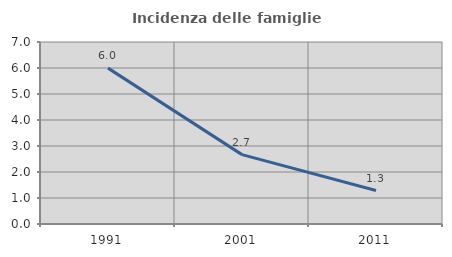
| Category | Incidenza delle famiglie numerose |
|---|---|
| 1991.0 | 5.995 |
| 2001.0 | 2.668 |
| 2011.0 | 1.286 |